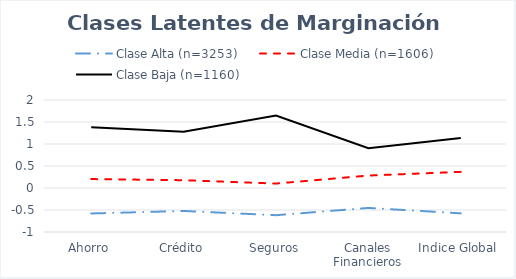
| Category | Clase Alta (n=3253) | Clase Media (n=1606) | Clase Baja (n=1160) |
|---|---|---|---|
| Ahorro | -0.579 | 0.203 | 1.38 |
| Crédito | -0.522 | 0.177 | 1.278 |
| Seguros | -0.618 | 0.101 | 1.647 |
| Canales Financieros | -0.453 | 0.283 | 0.904 |
| Indice Global | -0.576 | 0.367 | 1.138 |